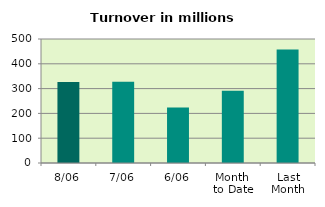
| Category | Series 0 |
|---|---|
| 8/06 | 326.573 |
| 7/06 | 327.839 |
| 6/06 | 224.163 |
| Month 
to Date | 291.322 |
| Last
Month | 457.674 |